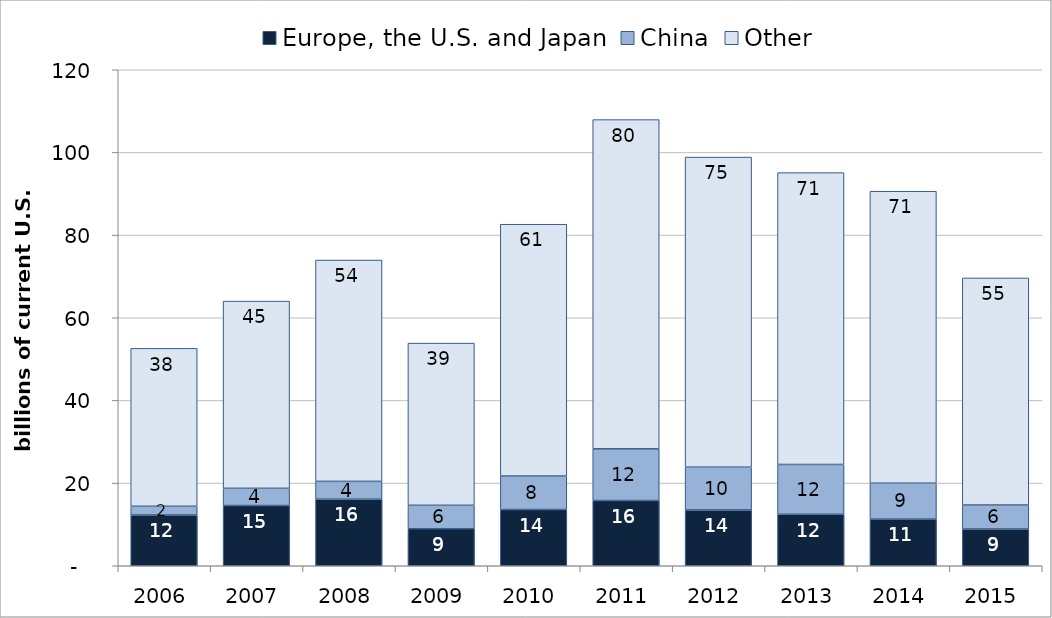
| Category | Europe, the U.S. and Japan | China | Other |
|---|---|---|---|
| 2006.0 | 12.285 | 2.109 | 38.208 |
| 2007.0 | 14.568 | 4.17 | 45.289 |
| 2008.0 | 16.107 | 4.31 | 53.549 |
| 2009.0 | 8.956 | 5.67 | 39.238 |
| 2010.0 | 13.611 | 8.095 | 60.919 |
| 2011.0 | 15.796 | 12.495 | 79.655 |
| 2012.0 | 13.518 | 10.337 | 75.017 |
| 2013.0 | 12.458 | 12.046 | 70.608 |
| 2014.0 | 11.289 | 8.68 | 70.643 |
| 2015.0 | 8.892 | 5.803 | 54.936 |